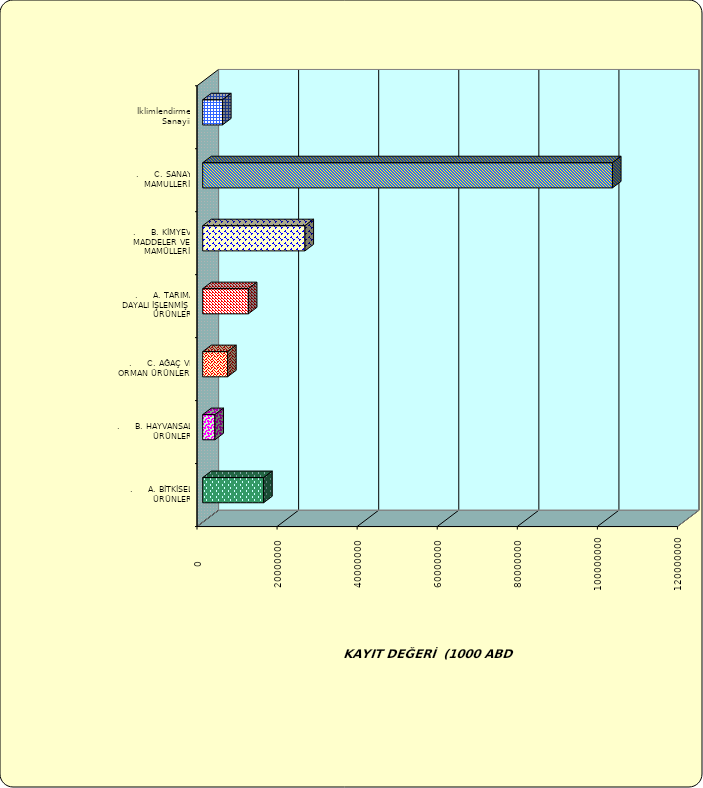
| Category | Series 0 |
|---|---|
| .     A. BİTKİSEL ÜRÜNLER | 15224762.057 |
| .     B. HAYVANSAL ÜRÜNLER | 3051897.413 |
| .     C. AĞAÇ VE ORMAN ÜRÜNLERİ | 6220068.838 |
| .     A. TARIMA DAYALI İŞLENMİŞ ÜRÜNLER | 11403600.168 |
| .     B. KİMYEVİ MADDELER VE MAMÜLLERİ | 25540664.886 |
| .     C. SANAYİ MAMULLERİ | 102338431.204 |
|  İklimlendirme Sanayii | 4946082.379 |